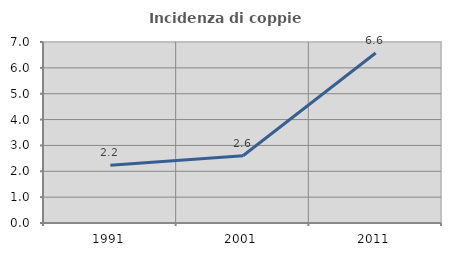
| Category | Incidenza di coppie miste |
|---|---|
| 1991.0 | 2.237 |
| 2001.0 | 2.603 |
| 2011.0 | 6.574 |